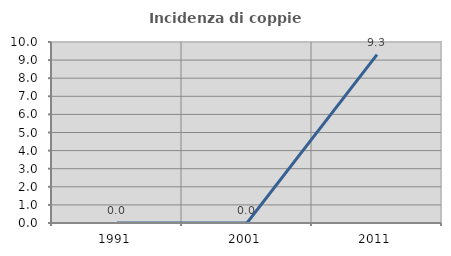
| Category | Incidenza di coppie miste |
|---|---|
| 1991.0 | 0 |
| 2001.0 | 0 |
| 2011.0 | 9.302 |